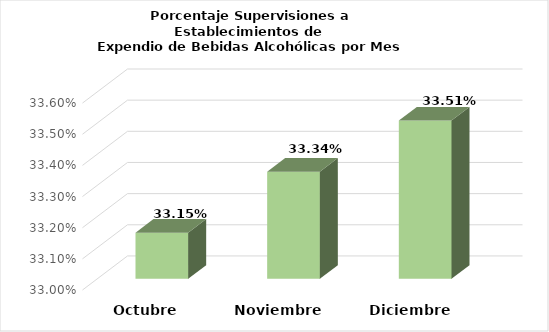
| Category | Series 0 |
|---|---|
| Octubre | 0.331 |
| Noviembre | 0.333 |
| Diciembre | 0.335 |